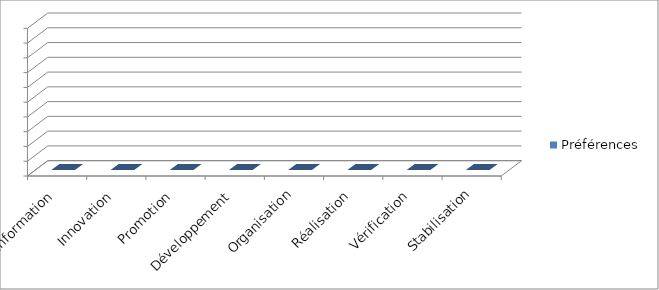
| Category | Préférences |
|---|---|
| Information | 0 |
| Innovation | 0 |
| Promotion | 0 |
| Développement | 0 |
| Organisation | 0 |
| Réalisation | 0 |
| Vérification | 0 |
| Stabilisation | 0 |